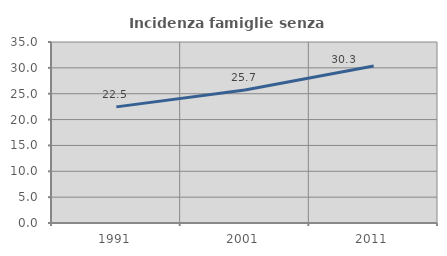
| Category | Incidenza famiglie senza nuclei |
|---|---|
| 1991.0 | 22.455 |
| 2001.0 | 25.706 |
| 2011.0 | 30.341 |